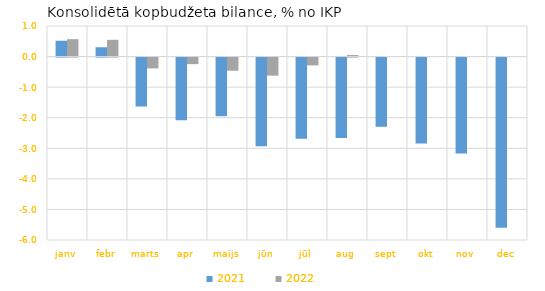
| Category | 2021 | 2022 |
|---|---|---|
| janv | 0.518 | 0.569 |
| febr | 0.305 | 0.548 |
| marts | -1.601 | -0.354 |
| apr | -2.051 | -0.215 |
| maijs | -1.918 | -0.43 |
| jūn | -2.901 | -0.592 |
| jūl | -2.656 | -0.256 |
| aug | -2.631 | 0.05 |
| sept | -2.264 | 0 |
| okt | -2.813 | 0 |
| nov | -3.139 | 0 |
| dec | -5.563 | 0 |